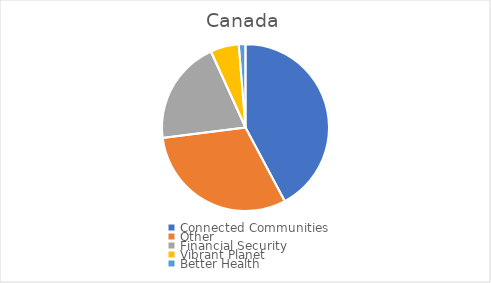
| Category | Series 0 |
|---|---|
| Connected Communities | 42.2 |
| Other | 30.8 |
| Financial Security | 20.2 |
| Vibrant Planet | 5.5 |
| Better Health | 1.3 |